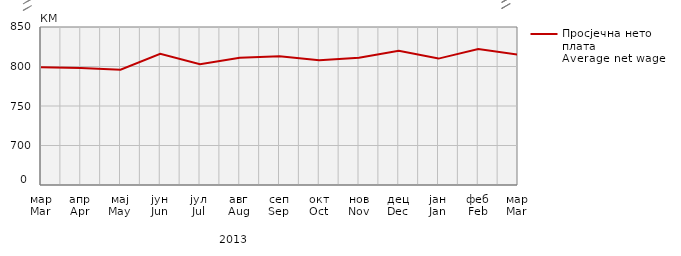
| Category | Просјечна нето плата
Average net wage |
|---|---|
| мар
Mar | 799 |
| апр
Apr | 798 |
| мај
May | 796 |
| јун
Jun | 816 |
| јул
Jul | 803 |
| авг
Aug | 811 |
| сеп
Sep | 813 |
| окт
Oct | 808 |
| нов
Nov | 811 |
| дец
Dec | 820 |
| јан
Jan | 810 |
| феб
Feb | 822 |
| мар
Mar | 815 |